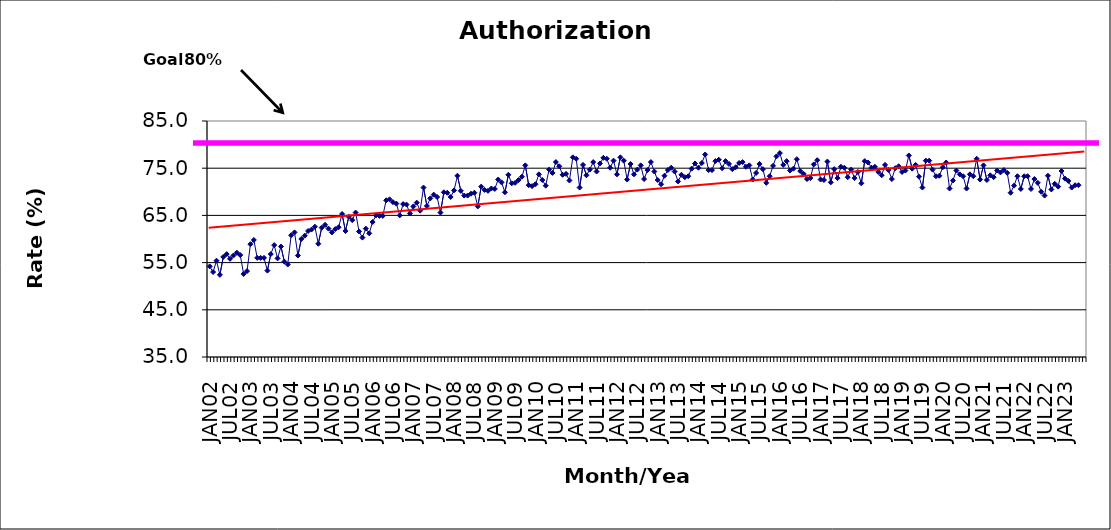
| Category | Series 0 |
|---|---|
| JAN02 | 54.2 |
| FEB02 | 53 |
| MAR02 | 55.4 |
| APR02 | 52.4 |
| MAY02 | 56.2 |
| JUN02 | 56.8 |
| JUL02 | 55.8 |
| AUG02 | 56.5 |
| SEP02 | 57.1 |
| OCT02 | 56.6 |
| NOV02 | 52.6 |
| DEC02 | 53.2 |
| JAN03 | 58.9 |
| FEB03 | 59.8 |
| MAR03 | 56 |
| APR03 | 56 |
| MAY03 | 56 |
| JUN03 | 53.3 |
| JUL03 | 56.8 |
| AUG03 | 58.7 |
| SEP03 | 55.9 |
| OCT03 | 58.4 |
| NOV03 | 55.2 |
| DEC03 | 54.6 |
| JAN04 | 60.8 |
| FEB04 | 61.4 |
| MAR04 | 56.5 |
| APR04 | 60 |
| MAY04 | 60.7 |
| JUN04 | 61.7 |
| JUL04 | 62 |
| AUG04 | 62.6 |
| SEP04 | 59 |
| OCT04 | 62.4 |
| NOV04 | 63 |
| DEC04 | 62.2 |
| JAN05 | 61.4 |
| FEB05 | 62.1 |
| MAR05 | 62.5 |
| APR05 | 65.3 |
| MAY05 | 61.7 |
| JUN05 | 64.7 |
| JUL05 | 64 |
| AUG05 | 65.6 |
| SEP05 | 61.6 |
| OCT05 | 60.3 |
| NOV05 | 62.2 |
| DEC05 | 61.2 |
| JAN06 | 63.6 |
| FEB06 | 65 |
| MAR06 | 64.9 |
| APR06 | 64.9 |
| MAY06 | 68.2 |
| JUN06 | 68.4 |
| JUL06 | 67.8 |
| AUG06 | 67.5 |
| SEP06 | 65 |
| OCT06 | 67.4 |
| NOV06 | 67.3 |
| DEC06 | 65.4 |
| JAN07 | 66.9 |
| FEB07 | 67.7 |
| MAR07 | 66 |
| APR07 | 70.9 |
| MAY07 | 67 |
| JUN07 | 68.6 |
| JUL07 | 69.4 |
| AUG07 | 68.9 |
| SEP07 | 65.6 |
| OCT07 | 69.9 |
| NOV07 | 69.8 |
| DEC07 | 68.9 |
| JAN08 | 70.3 |
| FEB08 | 73.4 |
| MAR08 | 70.2 |
| APR08 | 69.2 |
| MAY08 | 69.2 |
| JUN08 | 69.6 |
| JUL08 | 69.8 |
| AUG08 | 66.9 |
| SEP08 | 71.1 |
| OCT08 | 70.4 |
| NOV08 | 70.2 |
| DEC08 | 70.7 |
| JAN09 | 70.6 |
| FEB09 | 72.6 |
| MAR09 | 72 |
| APR09 | 69.9 |
| MAY09 | 73.6 |
| JUN09 | 71.8 |
| JUL09 | 71.9 |
| AUG09 | 72.5 |
| SEP09 | 73.2 |
| OCT09 | 75.6 |
| NOV09 | 71.4 |
| DEC09 | 71.2 |
| JAN10 | 71.6 |
| FEB10 | 73.7 |
| MAR10 | 72.5 |
| APR10 | 71.3 |
| MAY10 | 74.7 |
| JUN10 | 74 |
| JUL10 | 76.3 |
| AUG10 | 75.4 |
| SEP10 | 73.6 |
| OCT10 | 73.8 |
| NOV10 | 72.4 |
| DEC10 | 77.3 |
| JAN11 | 77 |
| FEB11 | 70.9 |
| MAR11 | 75.7 |
| APR11 | 73.5 |
| MAY11 | 74.7 |
| JUN11 | 76.3 |
| JUL11 | 74.3 |
| AUG11 | 76 |
| SEP11 | 77.2 |
| OCT11 | 77 |
| NOV11 | 75.1 |
| DEC11 | 76.6 |
| JAN12 | 73.7 |
| FEB12 | 77.3 |
| MAR12 | 76.6 |
| APR12 | 72.6 |
| MAY12 | 75.9 |
| JUN12 | 73.7 |
| JUL12 | 74.7 |
| AUG12 | 75.6 |
| SEP12 | 72.7 |
| OCT12 | 74.6 |
| NOV12 | 76.3 |
| DEC12 | 74.3 |
| JAN13 | 72.5 |
| FEB13 | 71.6 |
| MAR13 | 73.4 |
| APR13 | 74.6 |
| MAY13 | 75.1 |
| JUN13 | 74.3 |
| JUL13 | 72.2 |
| AUG13 | 73.6 |
| SEP13 | 73.1 |
| OCT13 | 73.3 |
| NOV13 | 74.9 |
| DEC13 | 76 |
| JAN14 | 75.1 |
| FEB14 | 76.1 |
| MAR14 | 77.9 |
| APR14 | 74.6 |
| MAY14 | 74.6 |
| JUN14 | 76.5 |
| JUL14 | 76.8 |
| AUG14 | 75 |
| SEP14 | 76.5 |
| OCT14 | 75.9 |
| NOV14 | 74.8 |
| DEC14 | 75.2 |
| JAN15 | 76.1 |
| FEB15 | 76.3 |
| MAR15 | 75.3 |
| APR15 | 75.6 |
| MAY15 | 72.6 |
| JUN15 | 74 |
| JUL15 | 75.9 |
| AUG15 | 74.8 |
| SEP15 | 71.9 |
| OCT15 | 73.3 |
| NOV15 | 75.5 |
| DEC15 | 77.5 |
| JAN16 | 78.2 |
| FEB16 | 75.7 |
| MAR16 | 76.5 |
| APR16 | 74.5 |
| MAY16 | 74.9 |
| JUN16 | 76.9 |
| JUL16 | 74.4 |
| AUG16 | 73.8 |
| SEP16 | 72.7 |
| OCT16 | 72.9 |
| NOV16 | 75.8 |
| DEC16 | 76.7 |
| JAN17 | 72.6 |
| FEB17 | 72.5 |
| MAR17 | 76.4 |
| APR17 | 72 |
| MAY17 | 74.8 |
| JUN17 | 72.9 |
| JUL17 | 75.3 |
| AUG17 | 75.1 |
| SEP17 | 73.1 |
| OCT17 | 74.7 |
| NOV17 | 72.9 |
| DEC17 | 74.2 |
| JAN18 | 71.8 |
| FEB18 | 76.5 |
| MAR18 | 76.2 |
| APR18 | 75.1 |
| MAY18 | 75.3 |
| JUN18 | 74.2 |
| JUL18 | 73.5 |
| AUG18 | 75.7 |
| SEP18 | 74.6 |
| OCT18 | 72.7 |
| NOV18 | 75 |
| DEC18 | 75.4 |
| JAN19 | 74.2 |
| FEB19 | 74.5 |
| MAR19 | 77.7 |
| APR19 | 74.9 |
| MAY19 | 75.7 |
| JUN19 | 73.2 |
| JUL19 | 70.9 |
| AUG19 | 76.6 |
| SEP19 | 76.6 |
| OCT19 | 74.7 |
| NOV19 | 73.3 |
| DEC19 | 73.4 |
| JAN20 | 75.2 |
| FEB20 | 76.2 |
| MAR20 | 70.7 |
| APR20 | 72.4 |
| MAY20 | 74.5 |
| JUN20 | 73.7 |
| JUL20 | 73.3 |
| AUG20 | 70.7 |
| SEP20 | 73.7 |
| OCT20 | 73.3 |
| NOV20 | 77 |
| DEC20 | 72.6 |
| JAN21 | 75.6 |
| FEB21 | 72.5 |
| MAR21 | 73.5 |
| APR21 | 73.1 |
| MAY21 | 74.5 |
| JUN21 | 74.1 |
| JUL21 | 74.6 |
| AUG21 | 74 |
| SEP21 | 69.8 |
| OCT21 | 71.3 |
| NOV21 | 73.3 |
| DEC21 | 70.6 |
| JAN22 | 73.3 |
| FEB22 | 73.3 |
| MAR22 | 70.6 |
| APR22 | 72.7 |
| MAY22 | 71.9 |
| JUN22 | 70 |
| JUL22 | 69.2 |
| AUG22 | 73.4 |
| SEP22 | 70.5 |
| OCT22 | 71.7 |
| NOV22 | 71.1 |
| DEC22 | 74.4 |
| JAN23 | 72.8 |
| FEB23 | 72.3 |
| MAR23 | 70.9 |
| APR23 | 71.4 |
| MAY23 | 71.4 |